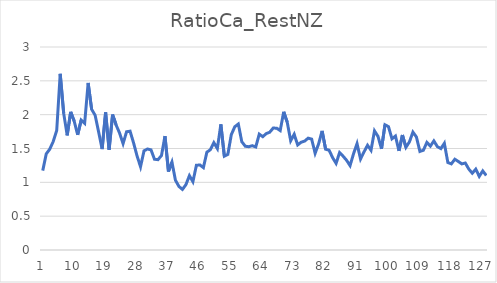
| Category | RatioCa_RestNZ |
|---|---|
| 0 | 1.173 |
| 1 | 1.421 |
| 2 | 1.49 |
| 3 | 1.603 |
| 4 | 1.766 |
| 5 | 2.605 |
| 6 | 2.019 |
| 7 | 1.694 |
| 8 | 2.041 |
| 9 | 1.905 |
| 10 | 1.702 |
| 11 | 1.919 |
| 12 | 1.872 |
| 13 | 2.468 |
| 14 | 2.079 |
| 15 | 1.99 |
| 16 | 1.746 |
| 17 | 1.492 |
| 18 | 2.033 |
| 19 | 1.482 |
| 20 | 2.002 |
| 21 | 1.848 |
| 22 | 1.728 |
| 23 | 1.572 |
| 24 | 1.747 |
| 25 | 1.756 |
| 26 | 1.584 |
| 27 | 1.392 |
| 28 | 1.23 |
| 29 | 1.466 |
| 30 | 1.493 |
| 31 | 1.48 |
| 32 | 1.341 |
| 33 | 1.335 |
| 34 | 1.397 |
| 35 | 1.684 |
| 36 | 1.16 |
| 37 | 1.299 |
| 38 | 1.031 |
| 39 | 0.939 |
| 40 | 0.895 |
| 41 | 0.966 |
| 42 | 1.099 |
| 43 | 1.009 |
| 44 | 1.252 |
| 45 | 1.257 |
| 46 | 1.217 |
| 47 | 1.446 |
| 48 | 1.482 |
| 49 | 1.586 |
| 50 | 1.499 |
| 51 | 1.857 |
| 52 | 1.387 |
| 53 | 1.412 |
| 54 | 1.706 |
| 55 | 1.822 |
| 56 | 1.862 |
| 57 | 1.6 |
| 58 | 1.534 |
| 59 | 1.527 |
| 60 | 1.542 |
| 61 | 1.522 |
| 62 | 1.712 |
| 63 | 1.675 |
| 64 | 1.72 |
| 65 | 1.741 |
| 66 | 1.803 |
| 67 | 1.8 |
| 68 | 1.765 |
| 69 | 2.043 |
| 70 | 1.891 |
| 71 | 1.614 |
| 72 | 1.71 |
| 73 | 1.552 |
| 74 | 1.593 |
| 75 | 1.609 |
| 76 | 1.653 |
| 77 | 1.639 |
| 78 | 1.43 |
| 79 | 1.569 |
| 80 | 1.76 |
| 81 | 1.489 |
| 82 | 1.475 |
| 83 | 1.366 |
| 84 | 1.28 |
| 85 | 1.439 |
| 86 | 1.387 |
| 87 | 1.326 |
| 88 | 1.247 |
| 89 | 1.423 |
| 90 | 1.572 |
| 91 | 1.345 |
| 92 | 1.45 |
| 93 | 1.548 |
| 94 | 1.474 |
| 95 | 1.761 |
| 96 | 1.679 |
| 97 | 1.495 |
| 98 | 1.851 |
| 99 | 1.823 |
| 100 | 1.643 |
| 101 | 1.684 |
| 102 | 1.465 |
| 103 | 1.699 |
| 104 | 1.517 |
| 105 | 1.598 |
| 106 | 1.742 |
| 107 | 1.67 |
| 108 | 1.456 |
| 109 | 1.475 |
| 110 | 1.591 |
| 111 | 1.535 |
| 112 | 1.612 |
| 113 | 1.528 |
| 114 | 1.498 |
| 115 | 1.577 |
| 116 | 1.293 |
| 117 | 1.273 |
| 118 | 1.341 |
| 119 | 1.309 |
| 120 | 1.272 |
| 121 | 1.285 |
| 122 | 1.196 |
| 123 | 1.135 |
| 124 | 1.194 |
| 125 | 1.088 |
| 126 | 1.169 |
| 127 | 1.101 |